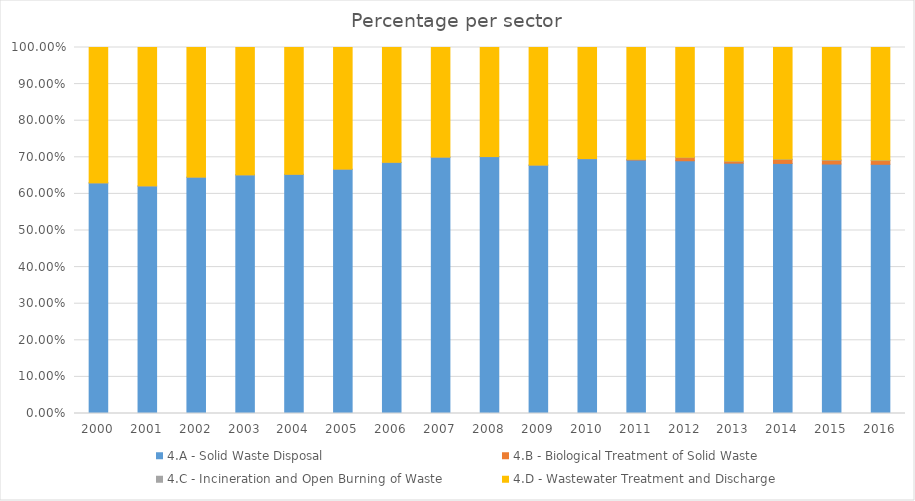
| Category | 4.A - Solid Waste Disposal | 4.B - Biological Treatment of Solid Waste | 4.C - Incineration and Open Burning of Waste | 4.D - Wastewater Treatment and Discharge |
|---|---|---|---|---|
| 2000.0 | 0.629 | 0 | 0.001 | 0.37 |
| 2001.0 | 0.621 | 0 | 0.001 | 0.378 |
| 2002.0 | 0.645 | 0 | 0.001 | 0.354 |
| 2003.0 | 0.651 | 0 | 0.001 | 0.348 |
| 2004.0 | 0.653 | 0 | 0.001 | 0.346 |
| 2005.0 | 0.667 | 0 | 0.001 | 0.332 |
| 2006.0 | 0.686 | 0 | 0.001 | 0.313 |
| 2007.0 | 0.7 | 0 | 0.001 | 0.299 |
| 2008.0 | 0.702 | 0 | 0.001 | 0.298 |
| 2009.0 | 0.678 | 0 | 0.001 | 0.321 |
| 2010.0 | 0.696 | 0 | 0.001 | 0.303 |
| 2011.0 | 0.693 | 0.001 | 0.001 | 0.305 |
| 2012.0 | 0.691 | 0.009 | 0.001 | 0.3 |
| 2013.0 | 0.684 | 0.005 | 0.001 | 0.31 |
| 2014.0 | 0.683 | 0.011 | 0.001 | 0.305 |
| 2015.0 | 0.682 | 0.01 | 0.001 | 0.307 |
| 2016.0 | 0.681 | 0.01 | 0.001 | 0.308 |